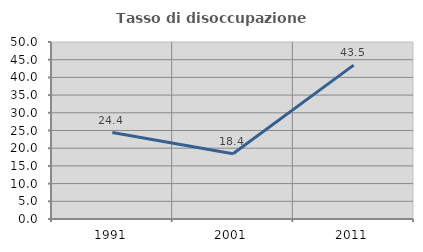
| Category | Tasso di disoccupazione giovanile  |
|---|---|
| 1991.0 | 24.419 |
| 2001.0 | 18.421 |
| 2011.0 | 43.478 |